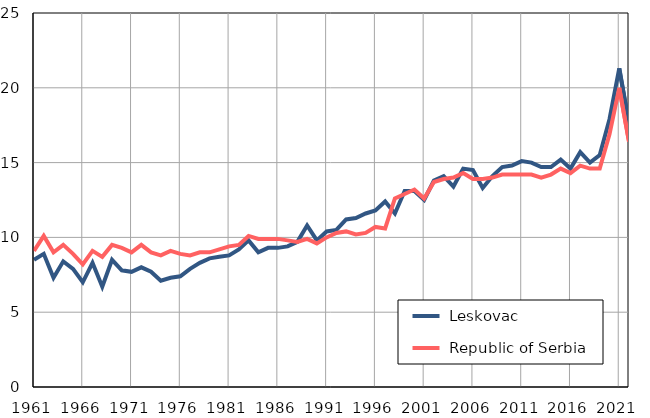
| Category |  Leskovac |  Republic of Serbia |
|---|---|---|
| 1961.0 | 8.5 | 9.1 |
| 1962.0 | 8.9 | 10.1 |
| 1963.0 | 7.3 | 9 |
| 1964.0 | 8.4 | 9.5 |
| 1965.0 | 7.9 | 8.9 |
| 1966.0 | 7 | 8.2 |
| 1967.0 | 8.3 | 9.1 |
| 1968.0 | 6.7 | 8.7 |
| 1969.0 | 8.5 | 9.5 |
| 1970.0 | 7.8 | 9.3 |
| 1971.0 | 7.7 | 9 |
| 1972.0 | 8 | 9.5 |
| 1973.0 | 7.7 | 9 |
| 1974.0 | 7.1 | 8.8 |
| 1975.0 | 7.3 | 9.1 |
| 1976.0 | 7.4 | 8.9 |
| 1977.0 | 7.9 | 8.8 |
| 1978.0 | 8.3 | 9 |
| 1979.0 | 8.6 | 9 |
| 1980.0 | 8.7 | 9.2 |
| 1981.0 | 8.8 | 9.4 |
| 1982.0 | 9.2 | 9.5 |
| 1983.0 | 9.8 | 10.1 |
| 1984.0 | 9 | 9.9 |
| 1985.0 | 9.3 | 9.9 |
| 1986.0 | 9.3 | 9.9 |
| 1987.0 | 9.4 | 9.8 |
| 1988.0 | 9.7 | 9.7 |
| 1989.0 | 10.8 | 9.9 |
| 1990.0 | 9.8 | 9.6 |
| 1991.0 | 10.4 | 10 |
| 1992.0 | 10.5 | 10.3 |
| 1993.0 | 11.2 | 10.4 |
| 1994.0 | 11.3 | 10.2 |
| 1995.0 | 11.6 | 10.3 |
| 1996.0 | 11.8 | 10.7 |
| 1997.0 | 12.4 | 10.6 |
| 1998.0 | 11.6 | 12.6 |
| 1999.0 | 13.1 | 12.9 |
| 2000.0 | 13.1 | 13.2 |
| 2001.0 | 12.5 | 12.6 |
| 2002.0 | 13.8 | 13.7 |
| 2003.0 | 14.1 | 13.9 |
| 2004.0 | 13.4 | 14 |
| 2005.0 | 14.6 | 14.3 |
| 2006.0 | 14.5 | 13.9 |
| 2007.0 | 13.3 | 13.9 |
| 2008.0 | 14.1 | 14 |
| 2009.0 | 14.7 | 14.2 |
| 2010.0 | 14.8 | 14.2 |
| 2011.0 | 15.1 | 14.2 |
| 2012.0 | 15 | 14.2 |
| 2013.0 | 14.7 | 14 |
| 2014.0 | 14.7 | 14.2 |
| 2015.0 | 15.2 | 14.6 |
| 2016.0 | 14.6 | 14.3 |
| 2017.0 | 15.7 | 14.8 |
| 2018.0 | 15 | 14.6 |
| 2019.0 | 15.5 | 14.6 |
| 2020.0 | 17.9 | 16.9 |
| 2021.0 | 21.3 | 20 |
| 2022.0 | 17.6 | 16.4 |